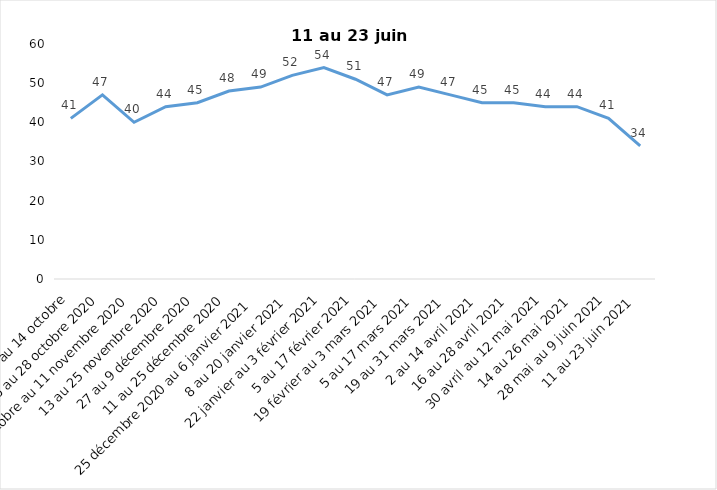
| Category | Toujours aux trois mesures |
|---|---|
| 2 au 14 octobre | 41 |
| 16 au 28 octobre 2020 | 47 |
| 30 octobre au 11 novembre 2020 | 40 |
| 13 au 25 novembre 2020 | 44 |
| 27 au 9 décembre 2020 | 45 |
| 11 au 25 décembre 2020 | 48 |
| 25 décembre 2020 au 6 janvier 2021 | 49 |
| 8 au 20 janvier 2021 | 52 |
| 22 janvier au 3 février 2021 | 54 |
| 5 au 17 février 2021 | 51 |
| 19 février au 3 mars 2021 | 47 |
| 5 au 17 mars 2021 | 49 |
| 19 au 31 mars 2021 | 47 |
| 2 au 14 avril 2021 | 45 |
| 16 au 28 avril 2021 | 45 |
| 30 avril au 12 mai 2021 | 44 |
| 14 au 26 mai 2021 | 44 |
| 28 mai au 9 juin 2021 | 41 |
| 11 au 23 juin 2021 | 34 |